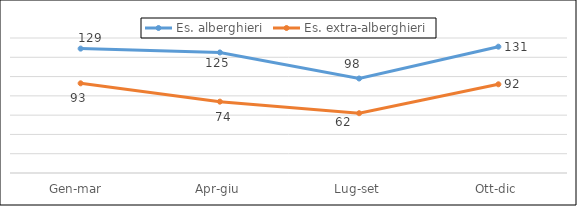
| Category | Es. alberghieri | Es. extra-alberghieri |
|---|---|---|
| Gen-mar  | 129 | 93 |
| Apr-giu | 125 | 74 |
| Lug-set | 98 | 62 |
| Ott-dic | 131 | 92 |